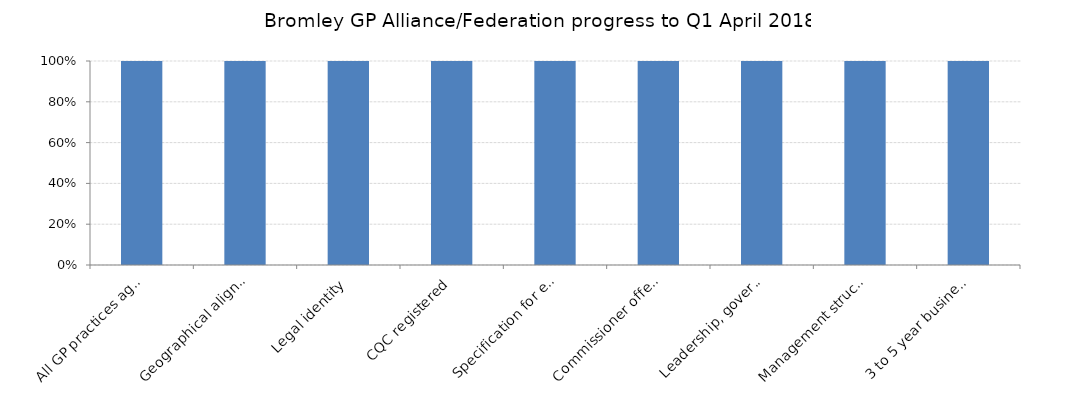
| Category | Series 0 |
|---|---|
| All GP practices agreed to alliance | 1 |
| Geographical alignment | 1 |
| Legal identity | 1 |
| CQC registered | 1 |
| Specification for enhanced primary care | 1 |
| Commissioner offer made and contract in place | 1 |
| Leadership, governance & decision-making arrangements in place | 1 |
| Management structure in place | 1 |
| 3 to 5 year business plan developed | 1 |